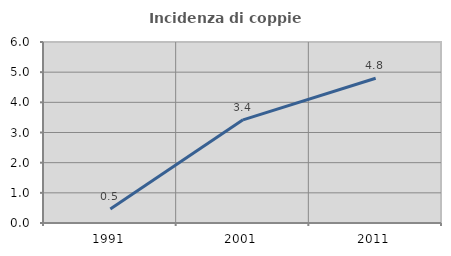
| Category | Incidenza di coppie miste |
|---|---|
| 1991.0 | 0.463 |
| 2001.0 | 3.421 |
| 2011.0 | 4.797 |